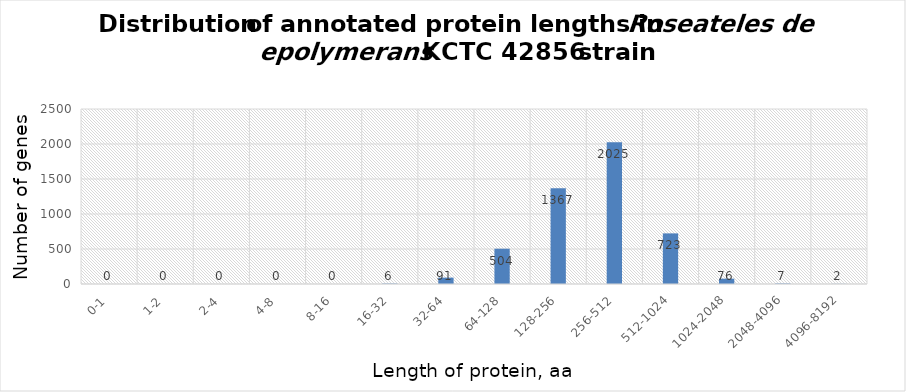
| Category | count |
|---|---|
| 0-1 | 0 |
| 1-2 | 0 |
| 2-4 | 0 |
| 4-8 | 0 |
| 8-16 | 0 |
| 16-32 | 6 |
| 32-64 | 91 |
| 64-128 | 504 |
| 128-256 | 1367 |
| 256-512 | 2025 |
| 512-1024 | 723 |
| 1024-2048 | 76 |
| 2048-4096 | 7 |
| 4096-8192 | 2 |